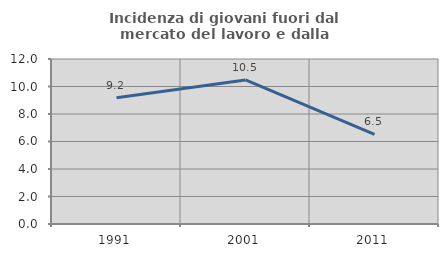
| Category | Incidenza di giovani fuori dal mercato del lavoro e dalla formazione  |
|---|---|
| 1991.0 | 9.184 |
| 2001.0 | 10.476 |
| 2011.0 | 6.522 |